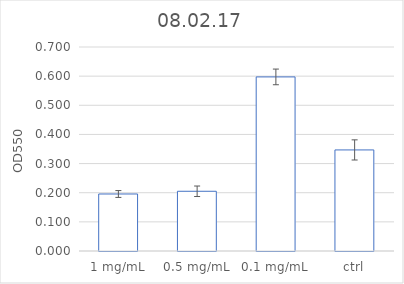
| Category | Series 0 |
|---|---|
| 1 mg/mL | 0.196 |
| 0.5 mg/mL | 0.205 |
| 0.1 mg/mL | 0.597 |
| ctrl | 0.347 |